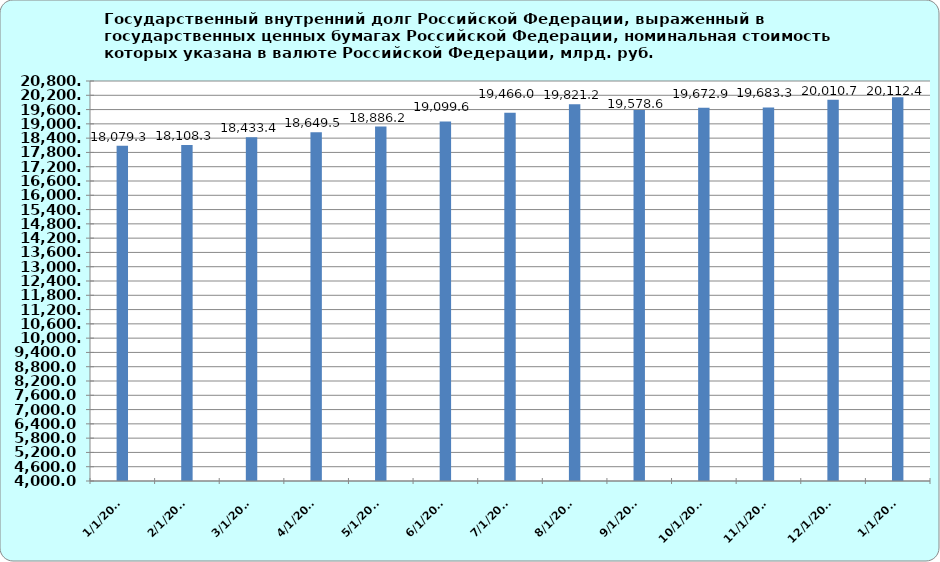
| Category | dates |
|---|---|
| 1/1/23 | 18079.291 |
| 2/1/23 | 18108.317 |
| 3/1/23 | 18433.449 |
| 4/1/23 | 18649.507 |
| 5/1/23 | 18886.191 |
| 6/1/23 | 19099.57 |
| 7/1/23 | 19466.04 |
| 8/1/23 | 19821.233 |
| 9/1/23 | 19578.637 |
| 10/1/23 | 19672.857 |
| 11/1/23 | 19683.306 |
| 12/1/23 | 20010.662 |
| 1/1/24 | 20112.36 |